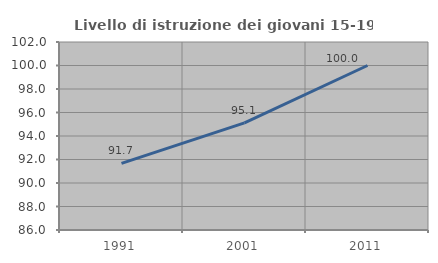
| Category | Livello di istruzione dei giovani 15-19 anni |
|---|---|
| 1991.0 | 91.667 |
| 2001.0 | 95.122 |
| 2011.0 | 100 |